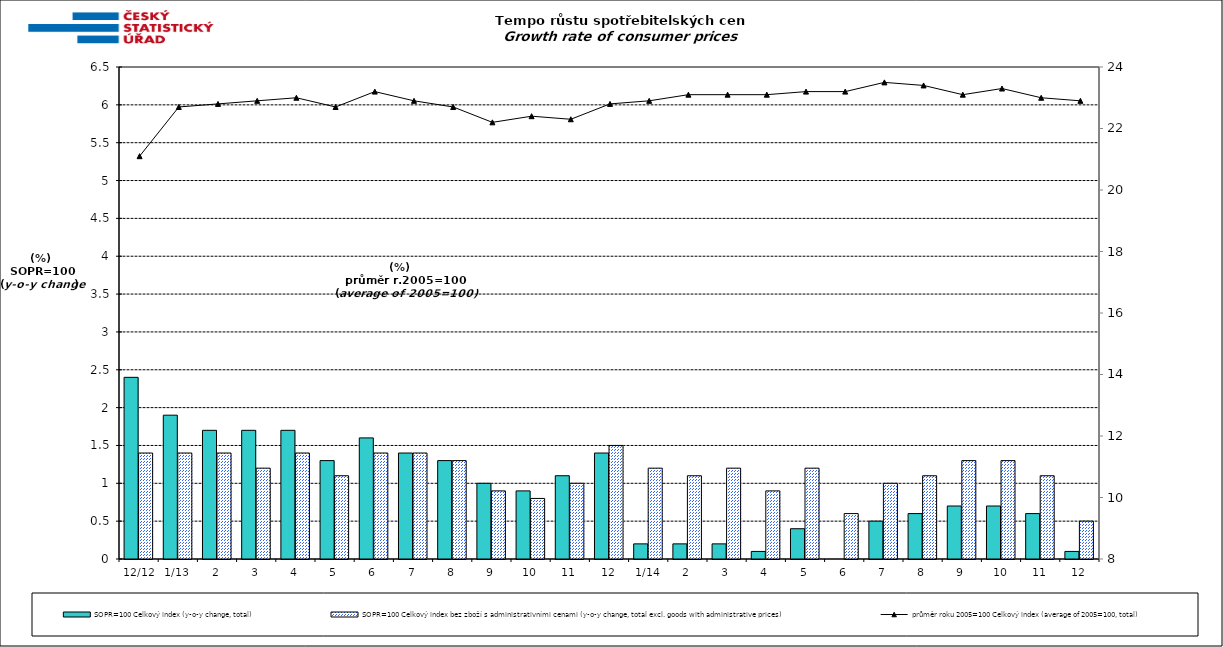
| Category | SOPR=100 Celkový index (y-o-y change, total) | SOPR=100 Celkový index bez zboží s administrativními cenami (y-o-y change, total excl. goods with administrative prices)  |
|---|---|---|
|  12/12 | 2.4 | 1.4 |
| 1/13 | 1.9 | 1.4 |
| 2 | 1.7 | 1.4 |
| 3 | 1.7 | 1.2 |
| 4 | 1.7 | 1.4 |
| 5 | 1.3 | 1.1 |
| 6 | 1.6 | 1.4 |
| 7 | 1.4 | 1.4 |
| 8 | 1.3 | 1.3 |
| 9 | 1 | 0.9 |
| 10 | 0.9 | 0.8 |
| 11 | 1.1 | 1 |
| 12 | 1.4 | 1.5 |
| 1/14 | 0.2 | 1.2 |
| 2 | 0.2 | 1.1 |
| 3 | 0.2 | 1.2 |
| 4 | 0.1 | 0.9 |
| 5 | 0.4 | 1.2 |
| 6 | 0 | 0.6 |
| 7 | 0.5 | 1 |
| 8 | 0.6 | 1.1 |
| 9 | 0.7 | 1.3 |
| 10 | 0.7 | 1.3 |
| 11 | 0.6 | 1.1 |
| 12 | 0.1 | 0.5 |